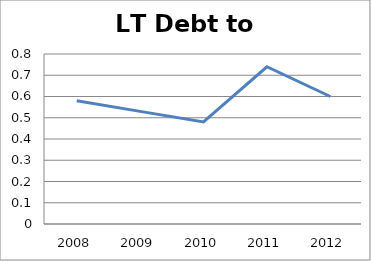
| Category | Series 0 |
|---|---|
| 2008.0 | 0.58 |
| 2009.0 | 0.53 |
| 2010.0 | 0.48 |
| 2011.0 | 0.74 |
| 2012.0 | 0.6 |